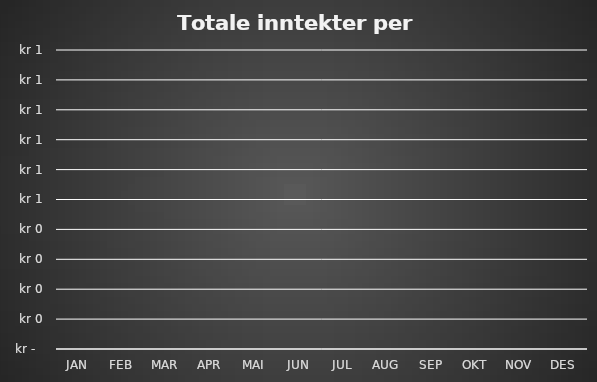
| Category | Series 0 |
|---|---|
| JAN | 0 |
| FEB | 0 |
| MAR | 0 |
| APR | 0 |
| MAI | 0 |
| JUN | 0 |
| JUL | 0 |
| AUG | 0 |
| SEP | 0 |
| OKT | 0 |
| NOV | 0 |
| DES | 0 |